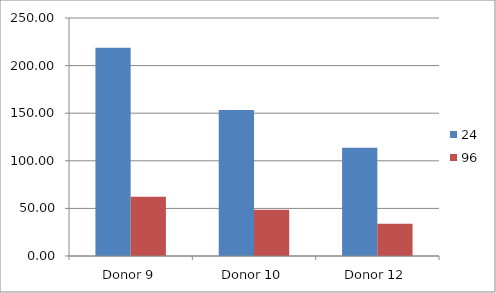
| Category | 24 | 96 |
|---|---|---|
| Donor 9 | 218.728 | 62.287 |
| Donor 10 | 153.345 | 48.652 |
| Donor 12 | 113.745 | 34.005 |